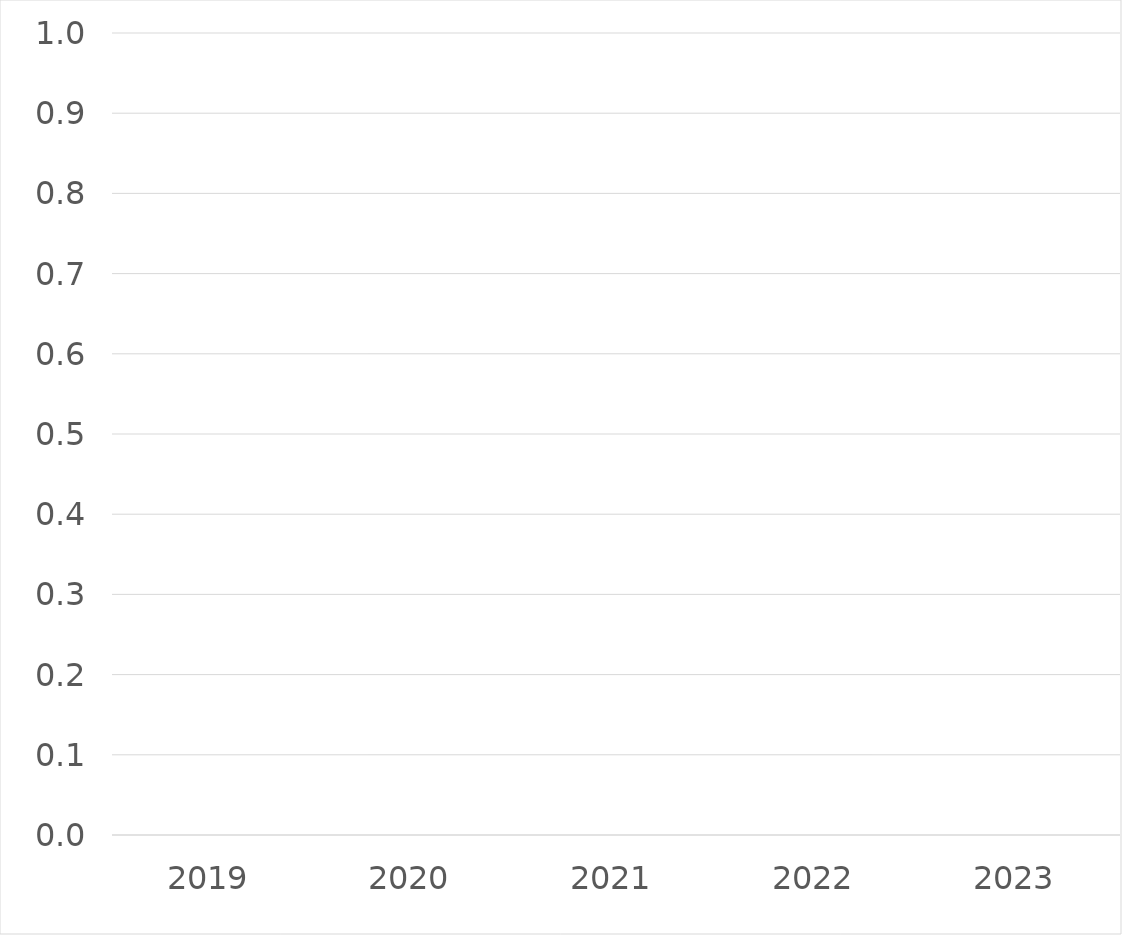
| Category | Series 0 |
|---|---|
| 2019 | 0 |
| 2020 | 0 |
| 2021 | 0 |
| 2022 | 0 |
| 2023 | 0 |